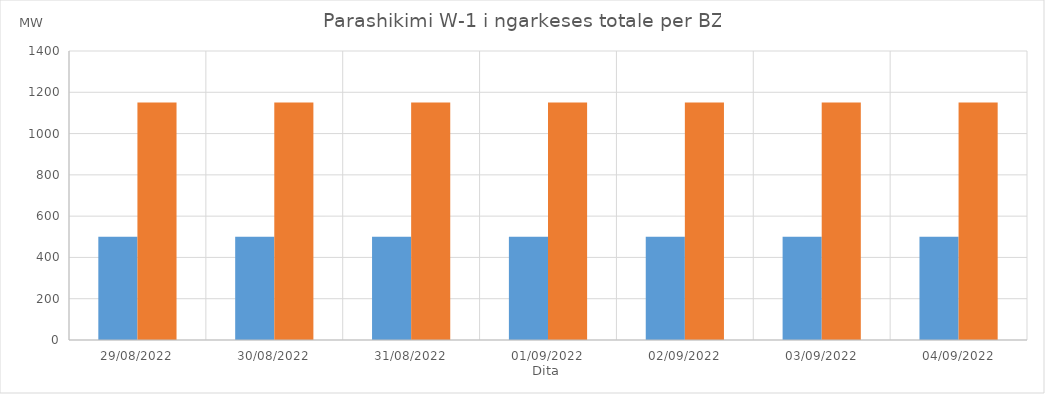
| Category | Min (MW) | Max (MW) |
|---|---|---|
| 29/08/2022 | 500 | 1150 |
| 30/08/2022 | 500 | 1150 |
| 31/08/2022 | 500 | 1150 |
| 01/09/2022 | 500 | 1150 |
| 02/09/2022 | 500 | 1150 |
| 03/09/2022 | 500 | 1150 |
| 04/09/2022 | 500 | 1150 |